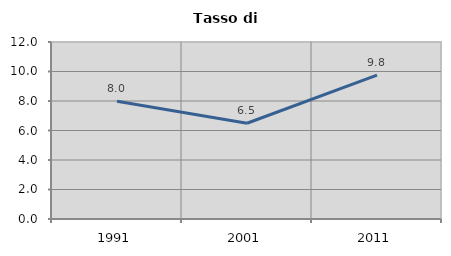
| Category | Tasso di disoccupazione   |
|---|---|
| 1991.0 | 7.981 |
| 2001.0 | 6.494 |
| 2011.0 | 9.756 |